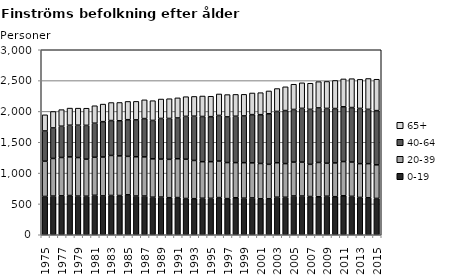
| Category | 0-19 | 20-39 | 40-64 | 65+ |
|---|---|---|---|---|
| 1975.0 | 621 | 572 | 490 | 262 |
| 1976.0 | 627 | 610 | 495 | 267 |
| 1977.0 | 631 | 622 | 507 | 269 |
| 1978.0 | 636 | 627 | 513 | 278 |
| 1979.0 | 627 | 625 | 525 | 276 |
| 1980.0 | 625 | 601 | 548 | 278 |
| 1981.0 | 640 | 617 | 552 | 283 |
| 1982.0 | 630 | 631 | 573 | 285 |
| 1983.0 | 637 | 649 | 566 | 292 |
| 1984.0 | 636 | 643 | 569 | 297 |
| 1985.0 | 648 | 623 | 595 | 296 |
| 1986.0 | 628 | 637 | 598 | 300 |
| 1987.0 | 628 | 635 | 621 | 304 |
| 1988.0 | 609 | 622 | 623 | 320 |
| 1989.0 | 611 | 616 | 659 | 315 |
| 1990.0 | 601 | 622 | 663 | 320 |
| 1991.0 | 603 | 630 | 661 | 326 |
| 1992.0 | 588 | 637 | 695 | 319 |
| 1993.0 | 585 | 620 | 718 | 320 |
| 1994.0 | 592 | 593 | 733 | 332 |
| 1995.0 | 591 | 594 | 730 | 331 |
| 1996.0 | 603 | 592 | 740 | 348 |
| 1997.0 | 586 | 585 | 740 | 362 |
| 1998.0 | 600 | 570 | 752 | 354 |
| 1999.0 | 593 | 576 | 758 | 350 |
| 2000.0 | 597 | 569 | 782 | 351 |
| 2001.0 | 583 | 573 | 791 | 357 |
| 2002.0 | 583 | 559 | 820 | 370 |
| 2003.0 | 609 | 559 | 832 | 371 |
| 2004.0 | 608 | 546 | 860 | 385 |
| 2005.0 | 629 | 549 | 854 | 409 |
| 2006.0 | 628 | 550 | 872 | 414 |
| 2007.0 | 620 | 522 | 892 | 423 |
| 2008.0 | 616 | 556 | 885 | 426 |
| 2009.0 | 625 | 535 | 889 | 437 |
| 2010.0 | 617 | 548 | 882 | 455 |
| 2011.0 | 632 | 555 | 888 | 452 |
| 2012.0 | 623 | 556 | 884 | 468 |
| 2013.0 | 605 | 548 | 896 | 471 |
| 2014.0 | 599 | 554 | 881 | 500 |
| 2015.0 | 589 | 545 | 879 | 509 |